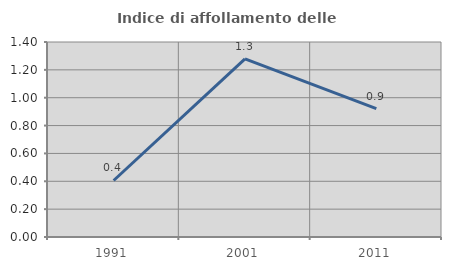
| Category | Indice di affollamento delle abitazioni  |
|---|---|
| 1991.0 | 0.406 |
| 2001.0 | 1.279 |
| 2011.0 | 0.922 |